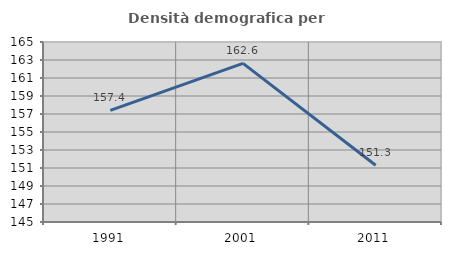
| Category | Densità demografica |
|---|---|
| 1991.0 | 157.401 |
| 2001.0 | 162.629 |
| 2011.0 | 151.313 |